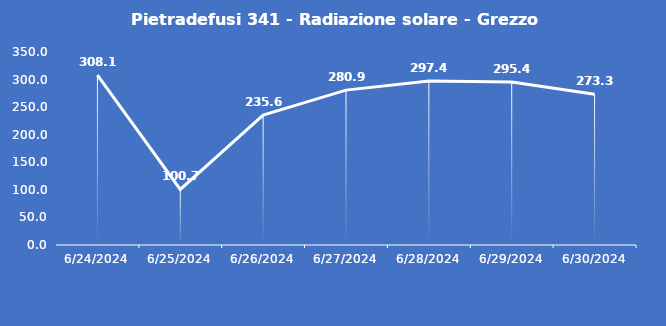
| Category | Pietradefusi 341 - Radiazione solare - Grezzo (W/m2) |
|---|---|
| 6/24/24 | 308.1 |
| 6/25/24 | 100.7 |
| 6/26/24 | 235.6 |
| 6/27/24 | 280.9 |
| 6/28/24 | 297.4 |
| 6/29/24 | 295.4 |
| 6/30/24 | 273.3 |